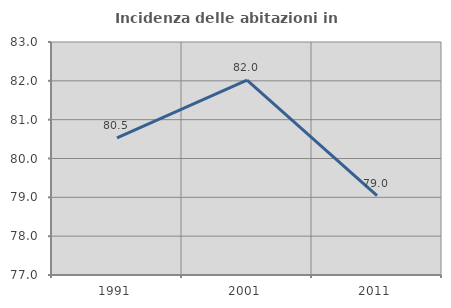
| Category | Incidenza delle abitazioni in proprietà  |
|---|---|
| 1991.0 | 80.53 |
| 2001.0 | 82.017 |
| 2011.0 | 79.045 |